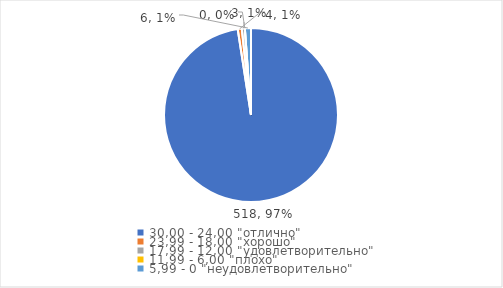
| Category | Series 0 | Series 1 |
|---|---|---|
| 30,00 - 24,00 "отлично" | 518 | 0.976 |
| 23,99 - 18,00 "хорошо" | 4 | 0.008 |
| 17,99 - 12,00 "удовлетворительно" | 3 | 0.006 |
| 11,99 - 6,00 "плохо" | 0 | 0 |
| 5,99 - 0 "неудовлетворительно" | 6 | 0.011 |